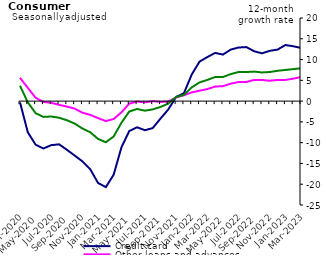
| Category | Credit card | Other loans and advances | Total |
|---|---|---|---|
| Mar-2020 | -0.3 | 5.6 | 3.7 |
| Apr-2020 | -7.5 | 3.2 | -0.3 |
| May-2020 | -10.5 | 0.8 | -2.9 |
| Jun-2020 | -11.4 | -0.2 | -3.8 |
| Jul-2020 | -10.6 | -0.4 | -3.7 |
| Aug-2020 | -10.4 | -0.9 | -4 |
| Sep-2020 | -11.7 | -1.3 | -4.6 |
| Oct-2020 | -13.1 | -1.8 | -5.4 |
| Nov-2020 | -14.5 | -2.8 | -6.6 |
| Dec-2020 | -16.4 | -3.3 | -7.5 |
| Jan-2021 | -19.7 | -4.1 | -9.1 |
| Feb-2021 | -20.7 | -4.8 | -9.9 |
| Mar-2021 | -17.7 | -4.3 | -8.5 |
| Apr-2021 | -11.1 | -2.7 | -5.2 |
| May-2021 | -7.2 | -0.6 | -2.5 |
| Jun-2021 | -6.3 | -0.1 | -1.9 |
| Jul-2021 | -7 | -0.3 | -2.3 |
| Aug-2021 | -6.5 | 0 | -2 |
| Sep-2021 | -4.2 | -0.2 | -1.4 |
| Oct-2021 | -2 | -0.1 | -0.6 |
| Nov-2021 | 1 | 0.9 | 1 |
| Dec-2021 | 1.9 | 1.4 | 1.5 |
| Jan-2022 | 6.4 | 2.1 | 3.3 |
| Feb-2022 | 9.5 | 2.5 | 4.5 |
| Mar-2022 | 10.6 | 2.9 | 5.1 |
| Apr-2022 | 11.6 | 3.5 | 5.8 |
| May-2022 | 11.2 | 3.6 | 5.8 |
| Jun-2022 | 12.4 | 4.2 | 6.5 |
| Jul-2022 | 12.9 | 4.6 | 7 |
| Aug-2022 | 13 | 4.6 | 7 |
| Sep-2022 | 12 | 5.1 | 7.1 |
| Oct-2022 | 11.5 | 5.1 | 6.9 |
| Nov-2022 | 12.1 | 4.9 | 7 |
| Dec-2022 | 12.4 | 5.1 | 7.3 |
| Jan-2023 | 13.5 | 5.1 | 7.5 |
| Feb-2023 | 13.2 | 5.4 | 7.7 |
| Mar-2023 | 12.8 | 5.8 | 7.9 |